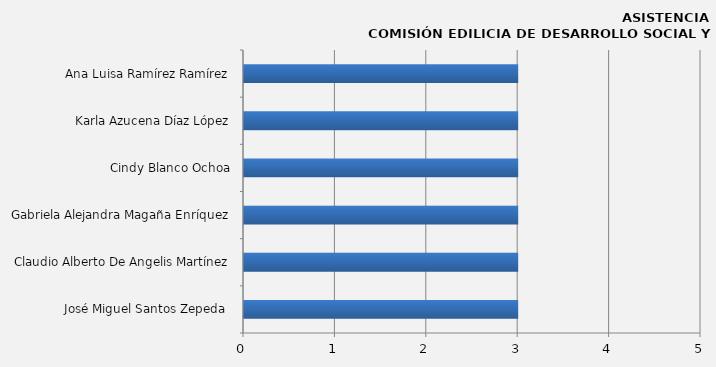
| Category | Series 0 |
|---|---|
| José Miguel Santos Zepeda  | 3 |
| Claudio Alberto De Angelis Martínez | 3 |
| Gabriela Alejandra Magaña Enríquez | 3 |
| Cindy Blanco Ochoa | 3 |
| Karla Azucena Díaz López | 3 |
| Ana Luisa Ramírez Ramírez | 3 |